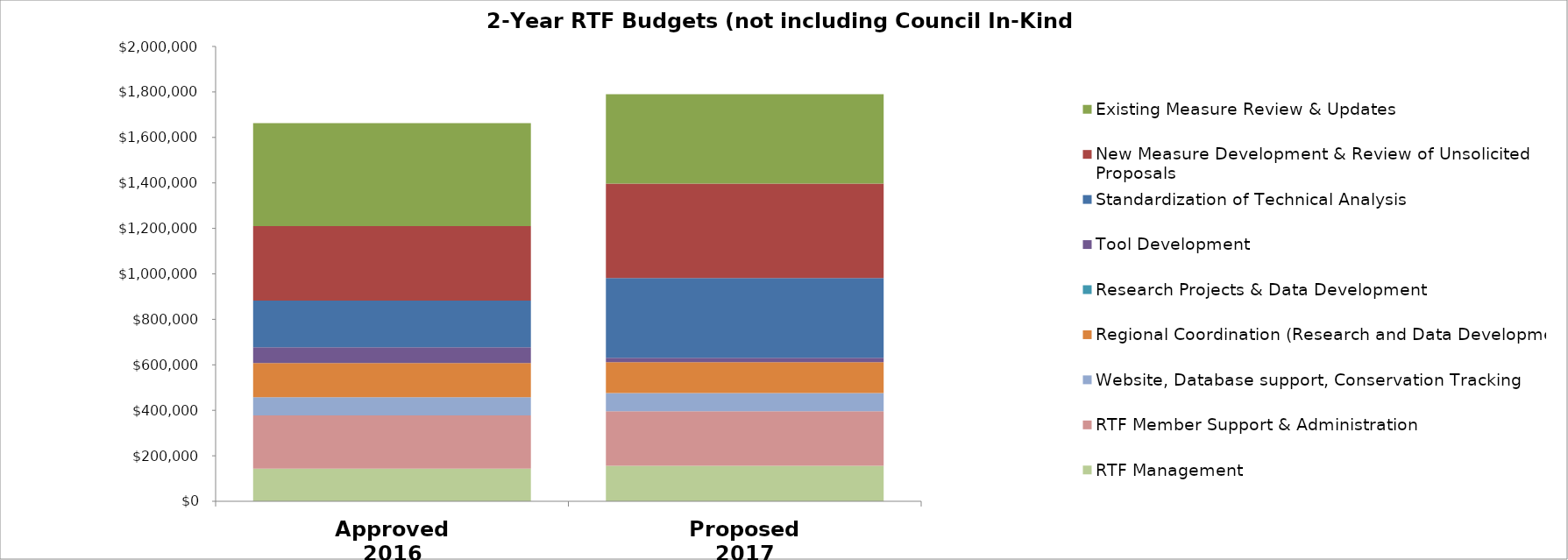
| Category | RTF Management | RTF Member Support & Administration | Website, Database support, Conservation Tracking  | Regional Coordination (Research and Data Development) | Research Projects & Data Development | Tool Development | Standardization of Technical Analysis | New Measure Development & Review of Unsolicited Proposals | Existing Measure Review & Updates |
|---|---|---|---|---|---|---|---|---|---|
| Approved 2016 | 143300 | 234200 | 80000 | 150000 | 0 | 70000 | 205000 | 328000 | 452500 |
| Proposed 2017 | 156300 | 240000 | 80000 | 135000 | 0 | 20000 | 350000 | 415500 | 393000 |